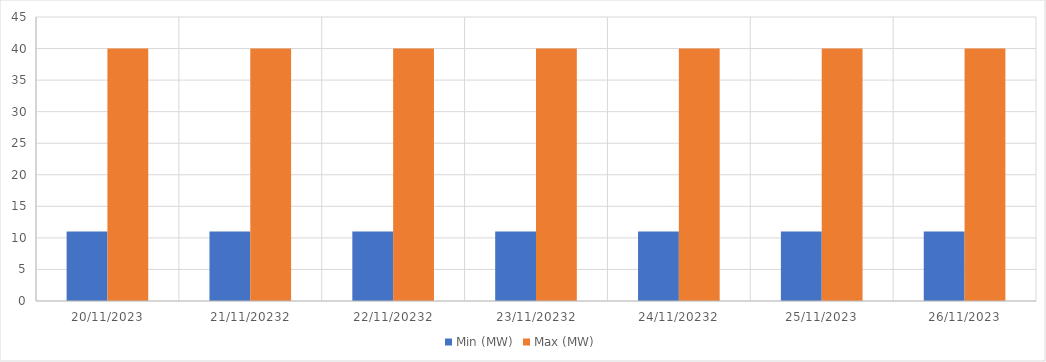
| Category | Min (MW) | Max (MW) |
|---|---|---|
| 20/11/2023 | 11 | 40 |
| 21/11/20232 | 11 | 40 |
| 22/11/20232 | 11 | 40 |
| 23/11/20232 | 11 | 40 |
| 24/11/20232 | 11 | 40 |
| 25/11/2023 | 11 | 40 |
| 26/11/2023 | 11 | 40 |